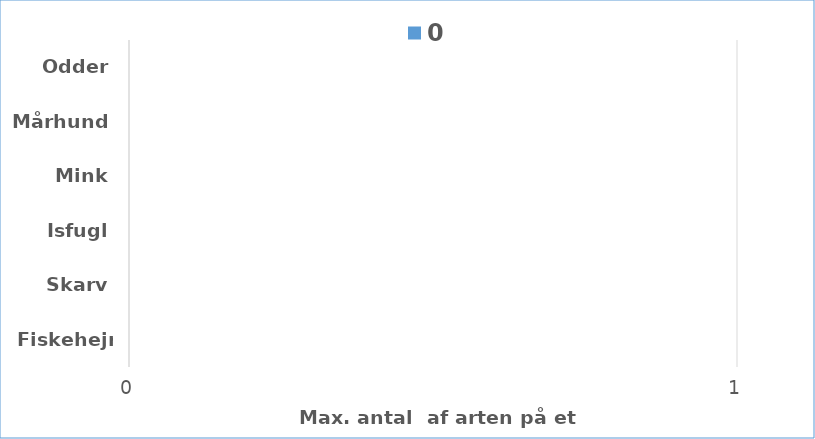
| Category | 0 |
|---|---|
| Fiskehejre | 0 |
| Skarv | 0 |
| Isfugl | 0 |
| Mink | 0 |
| Mårhund | 0 |
| Odder | 0 |